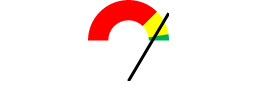
| Category | Series 0 |
|---|---|
| 0 | 0.75 |
| 1 | 0.2 |
| 2 | 0.05 |
| 3 | 1 |